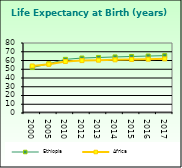
| Category | Ethiopia | Africa                        |
|---|---|---|
| 2000.0 | 51.938 | 53.721 |
| 2005.0 | 56.258 | 55.757 |
| 2010.0 | 61.319 | 58.857 |
| 2012.0 | 62.816 | 59.91 |
| 2013.0 | 63.464 | 60.376 |
| 2014.0 | 64.058 | 60.801 |
| 2015.0 | 64.602 | 61.187 |
| 2016.0 | 65.104 | 61.538 |
| 2017.0 | 65.571 | 61.865 |